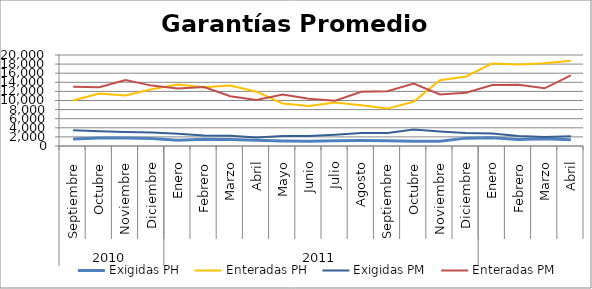
| Category | Exigidas PH | Enteradas PH | Exigidas PM | Enteradas PM |
|---|---|---|---|---|
| 0 | 1528.048 | 9989.528 | 3482.397 | 13040.893 |
| 1 | 1765.671 | 11522.563 | 3249.678 | 12931.878 |
| 2 | 1744.818 | 11123.372 | 3083.204 | 14519.409 |
| 3 | 1659.203 | 12493.623 | 2971.808 | 13273.812 |
| 4 | 1282.931 | 13511.197 | 2715.795 | 12631.271 |
| 5 | 1469.886 | 12912.935 | 2313.398 | 12967.84 |
| 6 | 1451.049 | 13292.147 | 2234.5 | 10944.124 |
| 7 | 1243.266 | 11940.059 | 1876.192 | 10106.188 |
| 8 | 1094.477 | 9346.935 | 2211.516 | 11309.35 |
| 9 | 1038.181 | 8772.488 | 2185.859 | 10360.845 |
| 10 | 1150.33 | 9583.522 | 2484.933 | 9954.534 |
| 11 | 1204.945 | 8947.225 | 2874.347 | 11912.953 |
| 12 | 1181.135 | 8218.837 | 2868.226 | 12046.458 |
| 13 | 1047.181 | 9725.758 | 3619.145 | 13704.352 |
| 14 | 1067.214 | 14456.861 | 3177.175 | 11327.495 |
| 15 | 1729.716 | 15271.717 | 2830.669 | 11719.895 |
| 16 | 1828.564 | 18155.583 | 2744.93 | 13413.991 |
| 17 | 1451.155 | 17917.734 | 2215.902 | 13440.832 |
| 18 | 1587.31 | 18166.129 | 1968.766 | 12673.714 |
| 19 | 1353.003 | 18741.256 | 2118.782 | 15515.723 |